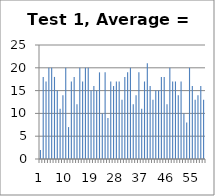
| Category | Series 0 |
|---|---|
| 0 | 2 |
| 1 | 18 |
| 2 | 17 |
| 3 | 20 |
| 4 | 20 |
| 5 | 18 |
| 6 | 15 |
| 7 | 11 |
| 8 | 14 |
| 9 | 20 |
| 10 | 7 |
| 11 | 17 |
| 12 | 18 |
| 13 | 12 |
| 14 | 20 |
| 15 | 17 |
| 16 | 20 |
| 17 | 20 |
| 18 | 15 |
| 19 | 16 |
| 20 | 15 |
| 21 | 19 |
| 22 | 10 |
| 23 | 19 |
| 24 | 9 |
| 25 | 17 |
| 26 | 16 |
| 27 | 17 |
| 28 | 17 |
| 29 | 13 |
| 30 | 18 |
| 31 | 19 |
| 32 | 20 |
| 33 | 12 |
| 34 | 14 |
| 35 | 19 |
| 36 | 11 |
| 37 | 17 |
| 38 | 21 |
| 39 | 16 |
| 40 | 13 |
| 41 | 15 |
| 42 | 15 |
| 43 | 18 |
| 44 | 18 |
| 45 | 12 |
| 46 | 20 |
| 47 | 17 |
| 48 | 17 |
| 49 | 14 |
| 50 | 17 |
| 51 | 10 |
| 52 | 8 |
| 53 | 20 |
| 54 | 16 |
| 55 | 13 |
| 56 | 14 |
| 57 | 16 |
| 58 | 13 |